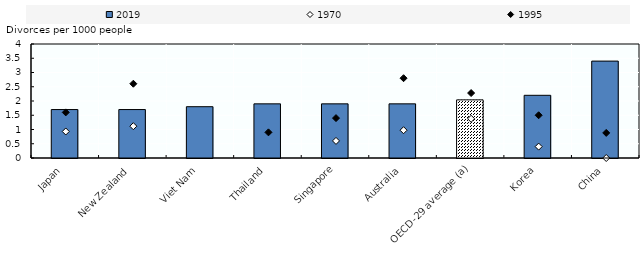
| Category | 2019 |
|---|---|
| Japan | 1.7 |
| New Zealand | 1.7 |
| Viet Nam | 1.8 |
| Thailand | 1.9 |
| Singapore | 1.9 |
| Australia | 1.9 |
| OECD-29 average (a) | 2.04 |
| Korea | 2.2 |
| China | 3.4 |